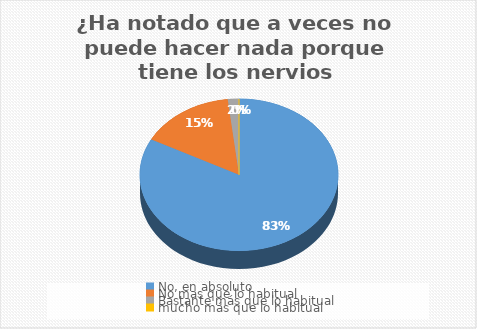
| Category | ¿Ha notado que a veces no puede hacer nada porque tiene los nervios desquiciados? |
|---|---|
| No, en absoluto  | 91 |
| No mas que lo habitual | 17 |
| Bastante más que lo habitual | 2 |
| mucho más que lo habitual | 0 |